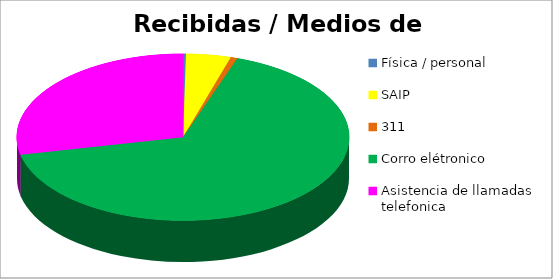
| Category |  Recibidas  |
|---|---|
| Física / personal | 3 |
| SAIP | 46 |
| 311 | 7 |
| Corro elétronico | 700 |
| Asistencia de llamadas telefonica | 300 |